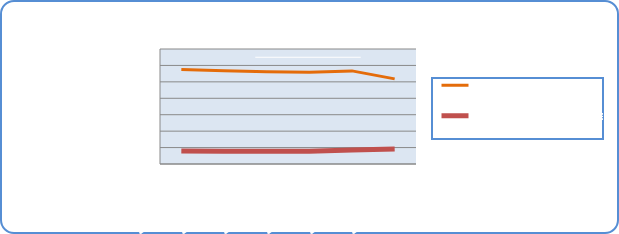
| Category | Motorin Türleri | Benzin Türleri |
|---|---|---|
| 5/20/19 | 57522032.713 | 7951996.39 |
| 5/21/19 | 56717819.053 | 7774881.571 |
| 5/22/19 | 56219386.36 | 7780173.929 |
| 5/23/19 | 55797397.45 | 7765231.364 |
| 5/24/19 | 56678307.642 | 8461386.43 |
| 5/25/19 | 51800397.239 | 9164217.867 |